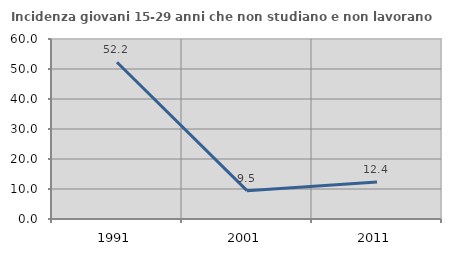
| Category | Incidenza giovani 15-29 anni che non studiano e non lavorano  |
|---|---|
| 1991.0 | 52.234 |
| 2001.0 | 9.457 |
| 2011.0 | 12.355 |